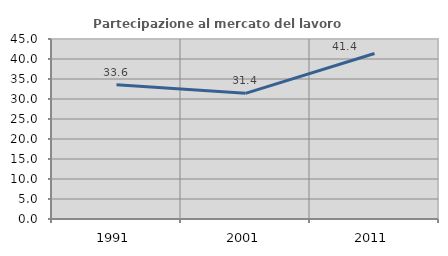
| Category | Partecipazione al mercato del lavoro  femminile |
|---|---|
| 1991.0 | 33.559 |
| 2001.0 | 31.416 |
| 2011.0 | 41.379 |